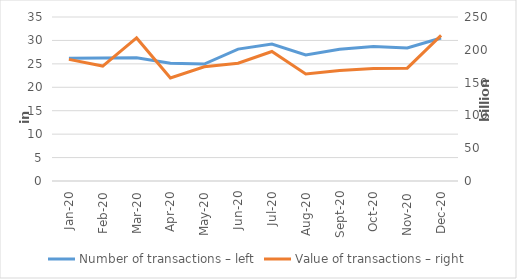
| Category | Number of transactions – left |
|---|---|
| 2020-01-01 | 26187016 |
| 2020-02-01 | 26229086 |
| 2020-03-01 | 26320801 |
| 2020-04-01 | 25151037 |
| 2020-05-01 | 24955287 |
| 2020-06-01 | 28153344 |
| 2020-07-01 | 29218048 |
| 2020-08-01 | 26904324 |
| 2020-09-01 | 28124270 |
| 2020-10-01 | 28694620 |
| 2020-11-01 | 28374689 |
| 2020-12-01 | 30518138 |